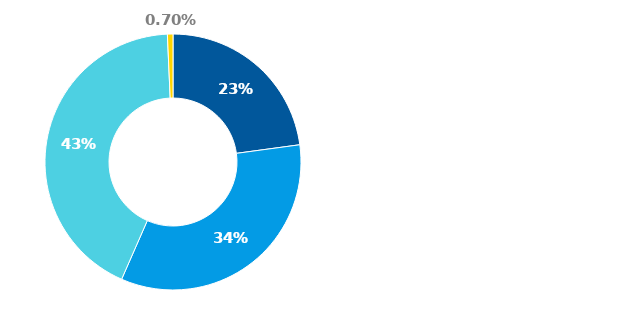
| Category | Series 0 |
|---|---|
| Hotovost | 0.228 |
| Půjčky poskytnuté nemovitostní společnosti | 0.337 |
| Majetkové účasti v nemovitostní společnosti | 0.427 |
| Ostatní finanční aktiva | 0.007 |